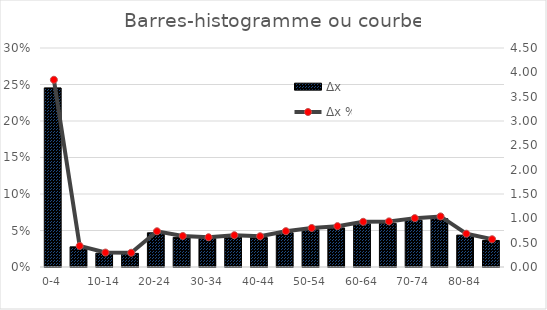
| Category | Δx |
|---|---|
| 0-4 | 0.245 |
| 5-9 | 0.028 |
| 10-14 | 0.019 |
| 15-19 | 0.019 |
| 20-24 | 0.047 |
| 25-29 | 0.041 |
| 30-34 | 0.039 |
| 35-39 | 0.042 |
| 40-44 | 0.04 |
| 45-49 | 0.047 |
| 50-54 | 0.051 |
| 55-59 | 0.054 |
| 60-64 | 0.059 |
| 65-69 | 0.06 |
| 70-74 | 0.064 |
| 75-79 | 0.066 |
| 80-84 | 0.044 |
| 85-+ | 0.036 |